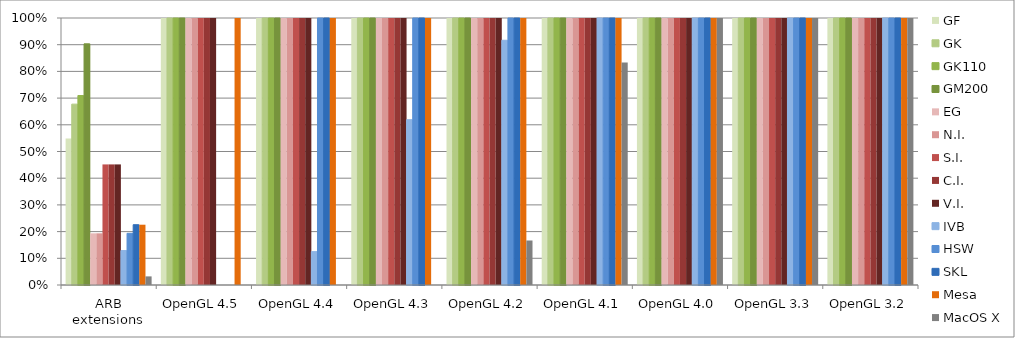
| Category | GF | GK | GK110 | GM200 | EG | N.I. | S.I. | C.I. | V.I. | IVB | HSW | SKL | Mesa | MacOS X |
|---|---|---|---|---|---|---|---|---|---|---|---|---|---|---|
| ARB extensions | 0.548 | 0.677 | 0.71 | 0.903 | 0.194 | 0.194 | 0.452 | 0.452 | 0.452 | 0.129 | 0.194 | 0.226 | 0.226 | 0.032 |
| OpenGL 4.5 | 1 | 1 | 1 | 1 | 1 | 1 | 1 | 1 | 1 | 0 | 0 | 0 | 1 | 0 |
| OpenGL 4.4 | 1 | 1 | 1 | 1 | 1 | 1 | 1 | 1 | 1 | 0.125 | 1 | 1 | 1 | 0 |
| OpenGL 4.3 | 1 | 1 | 1 | 1 | 1 | 1 | 1 | 1 | 1 | 0.619 | 1 | 1 | 1 | 0 |
| OpenGL 4.2 | 1 | 1 | 1 | 1 | 1 | 1 | 1 | 1 | 1 | 0.917 | 1 | 1 | 1 | 0.167 |
| OpenGL 4.1 | 1 | 1 | 1 | 1 | 1 | 1 | 1 | 1 | 1 | 1 | 1 | 1 | 1 | 0.833 |
| OpenGL 4.0 | 1 | 1 | 1 | 1 | 1 | 1 | 1 | 1 | 1 | 1 | 1 | 1 | 1 | 1 |
| OpenGL 3.3 | 1 | 1 | 1 | 1 | 1 | 1 | 1 | 1 | 1 | 1 | 1 | 1 | 1 | 1 |
| OpenGL 3.2 | 1 | 1 | 1 | 1 | 1 | 1 | 1 | 1 | 1 | 1 | 1 | 1 | 1 | 1 |